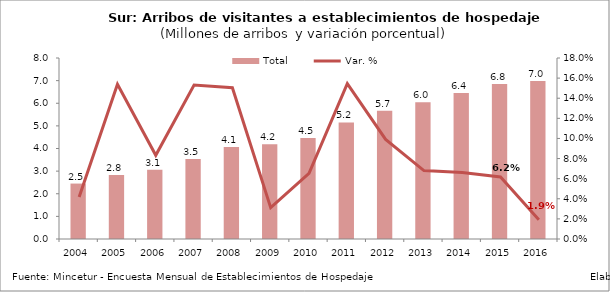
| Category | Total |
|---|---|
| 2004 | 2.45 |
| 2005 | 2.827 |
| 2006 | 3.063 |
| 2007 | 3.532 |
| 2008 | 4.063 |
| 2009 | 4.19 |
| 2010 | 4.464 |
| 2011 | 5.153 |
| 2012 | 5.663 |
| 2013 | 6.049 |
| 2014 | 6.449 |
| 2015 | 6.846 |
| 2016 | 6.978 |